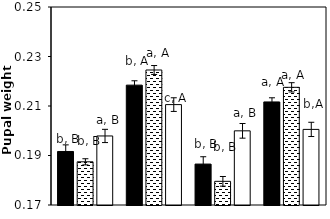
| Category | AB | AC | CK |
|---|---|---|---|
| aCO2-Bt | 0.192 | 0.187 | 0.198 |
| aCO2-Xy | 0.218 | 0.225 | 0.211 |
| eCO2-Bt | 0.187 | 0.18 | 0.2 |
| eCO2-Xy | 0.212 | 0.218 | 0.201 |